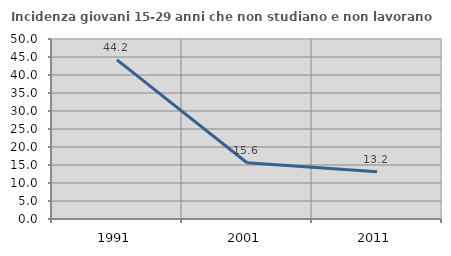
| Category | Incidenza giovani 15-29 anni che non studiano e non lavorano  |
|---|---|
| 1991.0 | 44.198 |
| 2001.0 | 15.625 |
| 2011.0 | 13.158 |